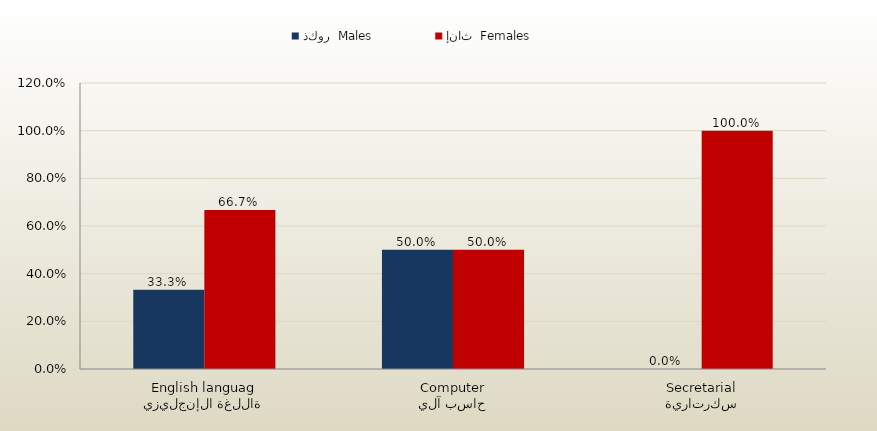
| Category | ذكور  Males | إناث  Females |
|---|---|---|
| اللغة الإنجليزية
English language | 0.333 | 0.667 |
| حاسب آلي
Computer | 0.5 | 0.5 |
| سكرتارية
Secretarial | 0 | 1 |